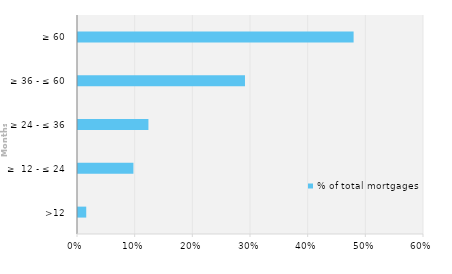
| Category | % of total mortgages |
|---|---|
| >12 | 0.014 |
| ≥  12 - ≤ 24 | 0.096 |
| ≥ 24 - ≤ 36 | 0.122 |
| ≥ 36 - ≤ 60 | 0.29 |
| ≥ 60 | 0.478 |